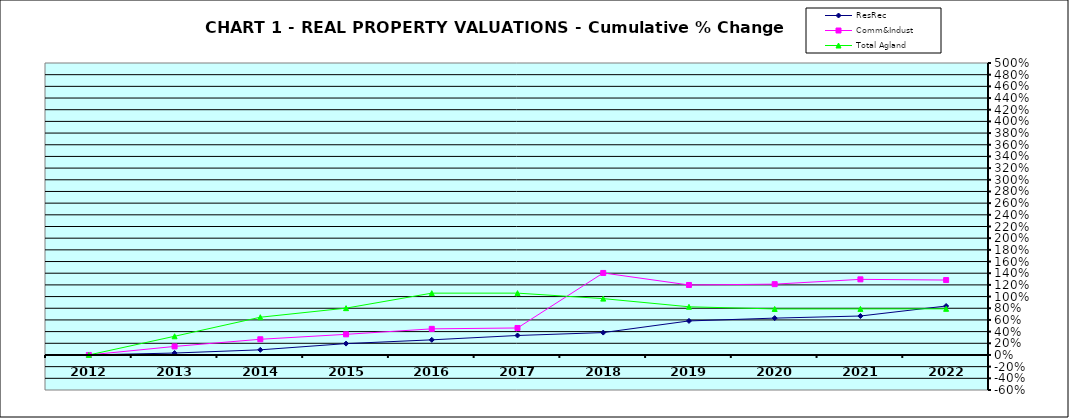
| Category | ResRec | Comm&Indust | Total Agland |
|---|---|---|---|
| 2012.0 | 0 | 0 | 0 |
| 2013.0 | 0.033 | 0.146 | 0.32 |
| 2014.0 | 0.088 | 0.269 | 0.646 |
| 2015.0 | 0.195 | 0.353 | 0.802 |
| 2016.0 | 0.259 | 0.447 | 1.059 |
| 2017.0 | 0.334 | 0.462 | 1.059 |
| 2018.0 | 0.383 | 1.405 | 0.965 |
| 2019.0 | 0.583 | 1.198 | 0.825 |
| 2020.0 | 0.631 | 1.213 | 0.788 |
| 2021.0 | 0.667 | 1.295 | 0.789 |
| 2022.0 | 0.838 | 1.283 | 0.79 |